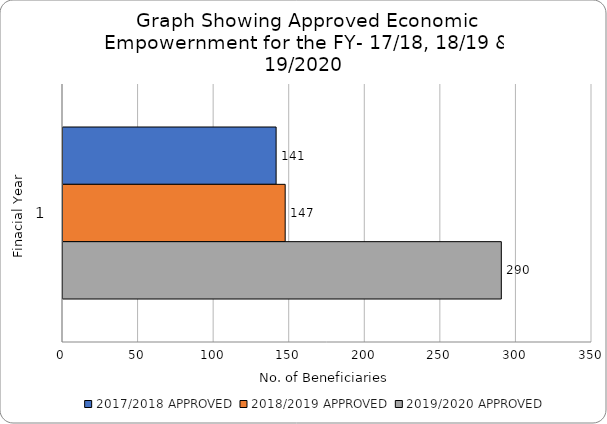
| Category | 2017/2018 APPROVED | 2018/2019 APPROVED | 2019/2020 APPROVED |
|---|---|---|---|
| 0 | 141 | 147 | 290 |